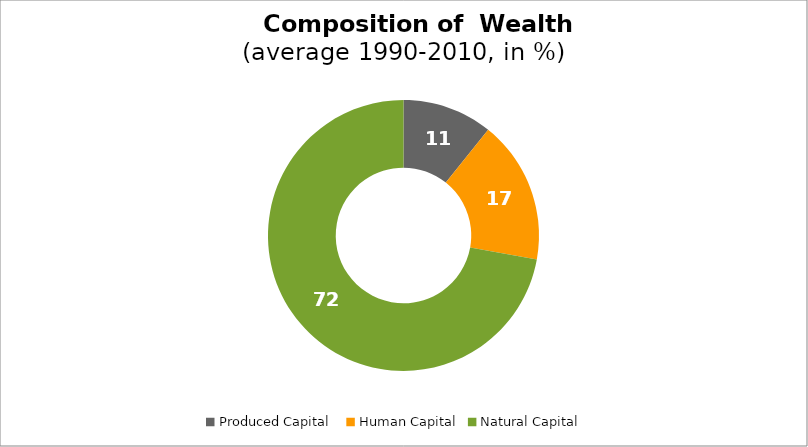
| Category | Series 0 |
|---|---|
| Produced Capital  | 10.74 |
| Human Capital | 17.108 |
| Natural Capital | 72.152 |